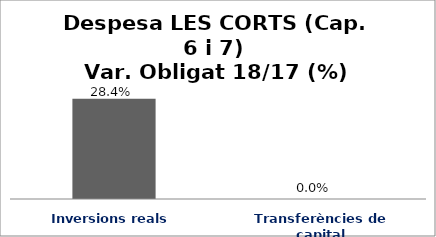
| Category | Series 0 |
|---|---|
| Inversions reals | 0.284 |
| Transferències de capital | 0 |